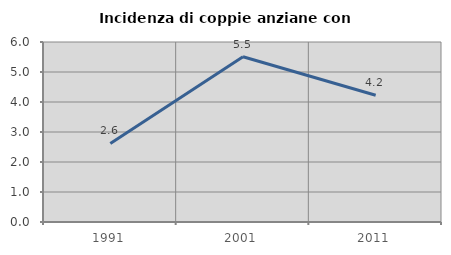
| Category | Incidenza di coppie anziane con figli |
|---|---|
| 1991.0 | 2.62 |
| 2001.0 | 5.51 |
| 2011.0 | 4.225 |